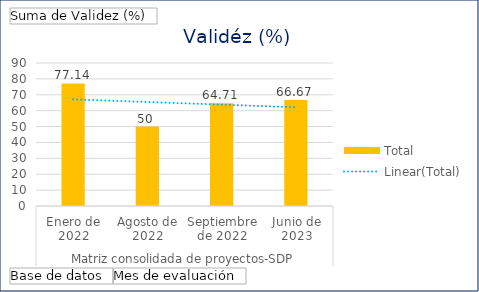
| Category | Total |
|---|---|
| 0 | 77.14 |
| 1 | 50 |
| 2 | 64.71 |
| 3 | 66.67 |